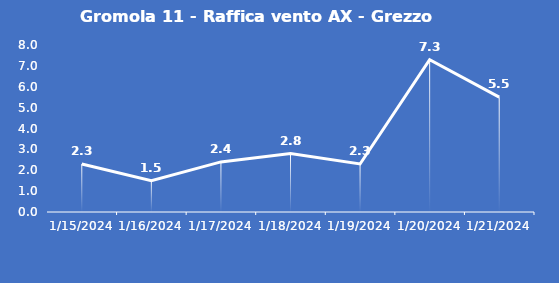
| Category | Gromola 11 - Raffica vento AX - Grezzo (m/s) |
|---|---|
| 1/15/24 | 2.3 |
| 1/16/24 | 1.5 |
| 1/17/24 | 2.4 |
| 1/18/24 | 2.8 |
| 1/19/24 | 2.3 |
| 1/20/24 | 7.3 |
| 1/21/24 | 5.5 |